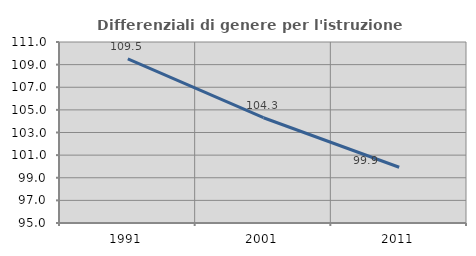
| Category | Differenziali di genere per l'istruzione superiore |
|---|---|
| 1991.0 | 109.505 |
| 2001.0 | 104.306 |
| 2011.0 | 99.927 |